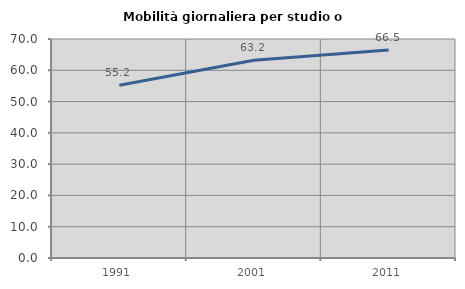
| Category | Mobilità giornaliera per studio o lavoro |
|---|---|
| 1991.0 | 55.241 |
| 2001.0 | 63.201 |
| 2011.0 | 66.521 |